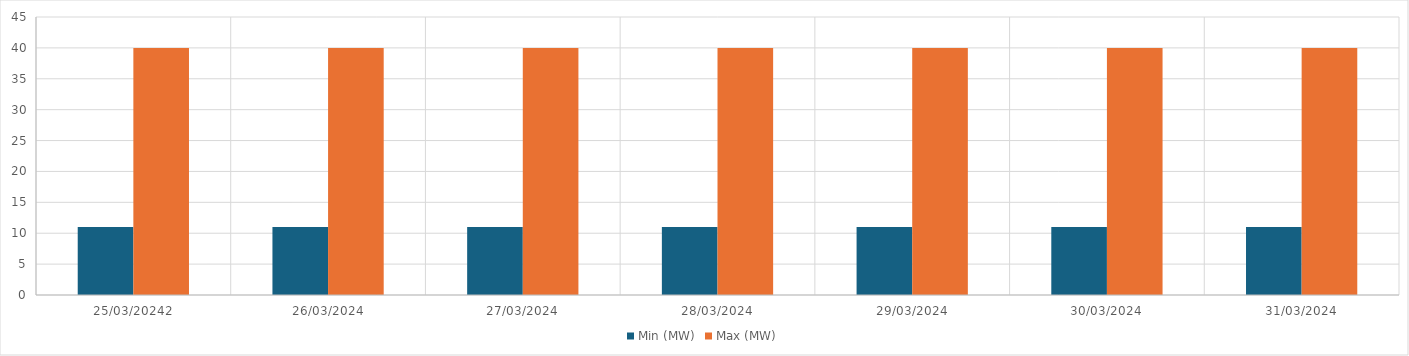
| Category | Min (MW) | Max (MW) |
|---|---|---|
| 25/03/20242 | 11 | 40 |
| 26/03/2024 | 11 | 40 |
| 27/03/2024 | 11 | 40 |
| 28/03/2024 | 11 | 40 |
| 29/03/2024 | 11 | 40 |
| 30/03/2024 | 11 | 40 |
| 31/03/2024 | 11 | 40 |